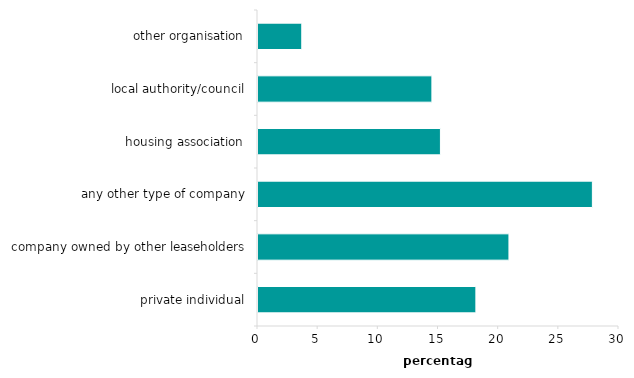
| Category | percentages |
|---|---|
| private individual | 18.107 |
| company owned by other leaseholders | 20.854 |
| any other type of company | 27.788 |
| housing association | 15.161 |
| local authority/council | 14.452 |
| other organisation | 3.638 |